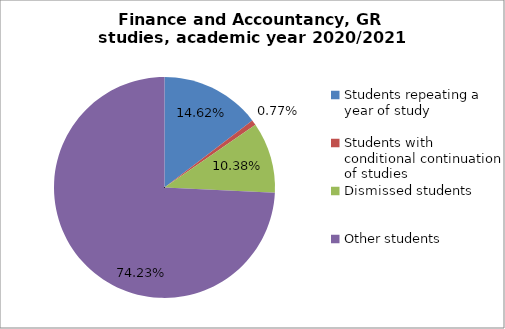
| Category | Series 0 |
|---|---|
| Students repeating a year of study | 38 |
| Students with conditional continuation of studies | 2 |
| Dismissed students | 27 |
| Other students | 193 |